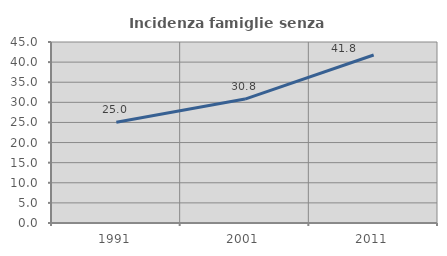
| Category | Incidenza famiglie senza nuclei |
|---|---|
| 1991.0 | 25.049 |
| 2001.0 | 30.813 |
| 2011.0 | 41.758 |